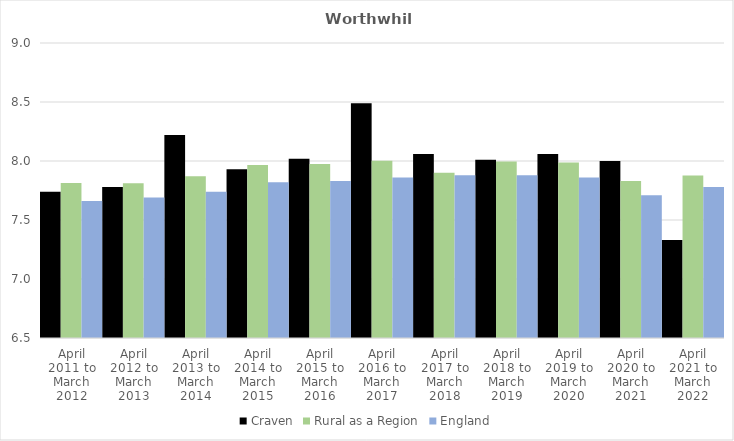
| Category | Craven | Rural as a Region | England |
|---|---|---|---|
| April 2011 to March 2012 | 7.74 | 7.813 | 7.66 |
| April 2012 to March 2013 | 7.78 | 7.811 | 7.69 |
| April 2013 to March 2014 | 8.22 | 7.871 | 7.74 |
| April 2014 to March 2015 | 7.93 | 7.967 | 7.82 |
| April 2015 to March 2016 | 8.02 | 7.975 | 7.83 |
| April 2016 to March 2017 | 8.49 | 8.002 | 7.86 |
| April 2017 to March 2018 | 8.06 | 7.9 | 7.88 |
| April 2018 to March 2019 | 8.01 | 7.996 | 7.88 |
| April 2019 to March 2020 | 8.06 | 7.988 | 7.86 |
| April 2020 to March 2021 | 8 | 7.831 | 7.71 |
| April 2021 to March 2022 | 7.33 | 7.877 | 7.78 |